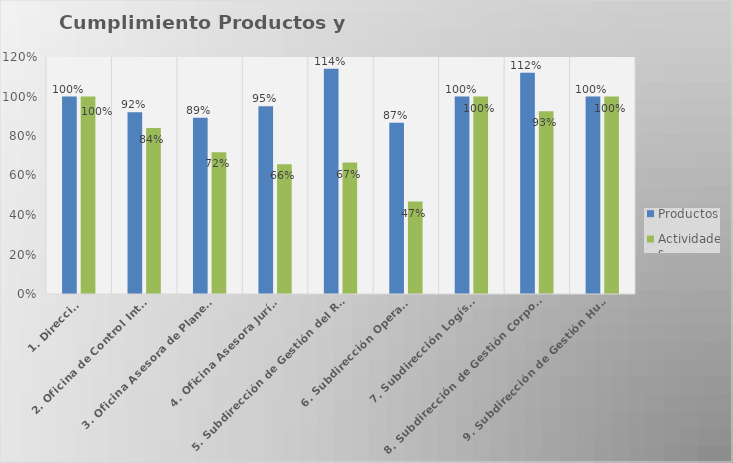
| Category | Productos | Actividades |
|---|---|---|
| 1. Dirección | 1 | 1 |
| 2. Oficina de Control Interno | 0.92 | 0.84 |
| 3. Oficina Asesora de Planeación | 0.892 | 0.718 |
| 4. Oficina Asesora Jurídica | 0.95 | 0.657 |
| 5. Subdirección de Gestión del Riesgo | 1.141 | 0.666 |
| 6. Subdirección Operativa | 0.867 | 0.468 |
| 7. Subdirección Logística | 1 | 1 |
| 8. Subdirección de Gestión Corporativa | 1.121 | 0.925 |
| 9. Subdirección de Gestión Humana | 1 | 1 |